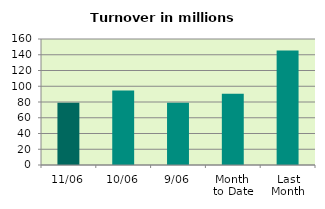
| Category | Series 0 |
|---|---|
| 11/06 | 79.18 |
| 10/06 | 94.638 |
| 9/06 | 79.191 |
| Month 
to Date | 90.505 |
| Last
Month | 145.388 |